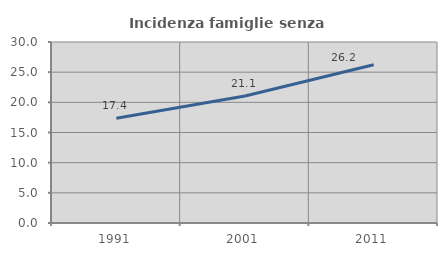
| Category | Incidenza famiglie senza nuclei |
|---|---|
| 1991.0 | 17.357 |
| 2001.0 | 21.053 |
| 2011.0 | 26.235 |